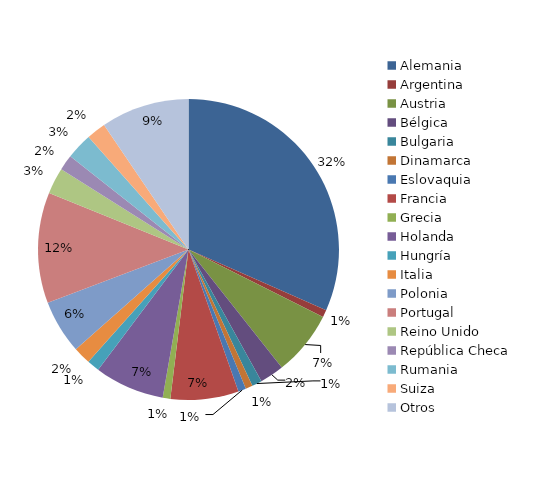
| Category | Comisiones Rogatorias |
|---|---|
| Alemania | 1467 |
| Argentina | 36 |
| Austria | 323 |
| Bélgica | 120 |
| Bulgaria | 50 |
| Dinamarca | 35 |
| Eslovaquia | 39 |
| Francia | 339 |
| Grecia | 38 |
| Holanda | 348 |
| Hungría | 62 |
| Italia | 87 |
| Polonia | 268 |
| Portugal | 552 |
| Reino Unido  | 131 |
| República Checa | 77 |
| Rumania | 131 |
| Suiza | 96 |
| Otros | 440 |